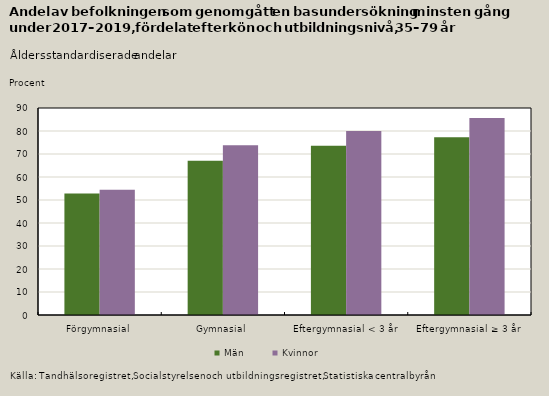
| Category | Män | Kvinnor |
|---|---|---|
| Förgymnasial | 52.8 | 54.5 |
| Gymnasial | 67.1 | 73.8 |
| Eftergymnasial < 3 år | 73.6 | 80 |
| Eftergymnasial ≥ 3 år | 77.3 | 85.6 |